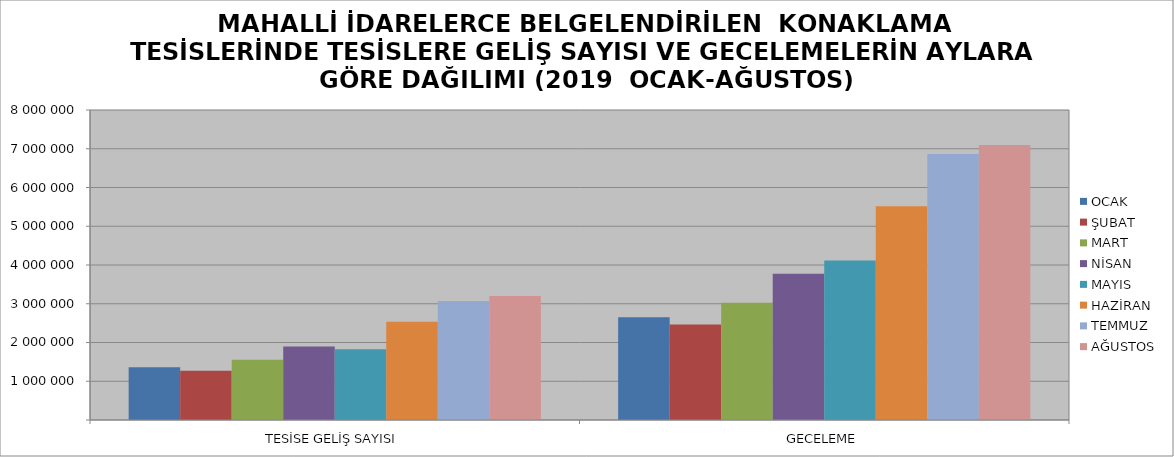
| Category | OCAK | ŞUBAT | MART | NİSAN | MAYIS | HAZİRAN | TEMMUZ | AĞUSTOS |
|---|---|---|---|---|---|---|---|---|
| TESİSE GELİŞ SAYISI | 1363187 | 1273727 | 1552518 | 1898202 | 1826154 | 2537491 | 3073499 | 3201724 |
| GECELEME | 2649437 | 2462023 | 3024704 | 3772615 | 4117532 | 5513568 | 6866550 | 7097153 |